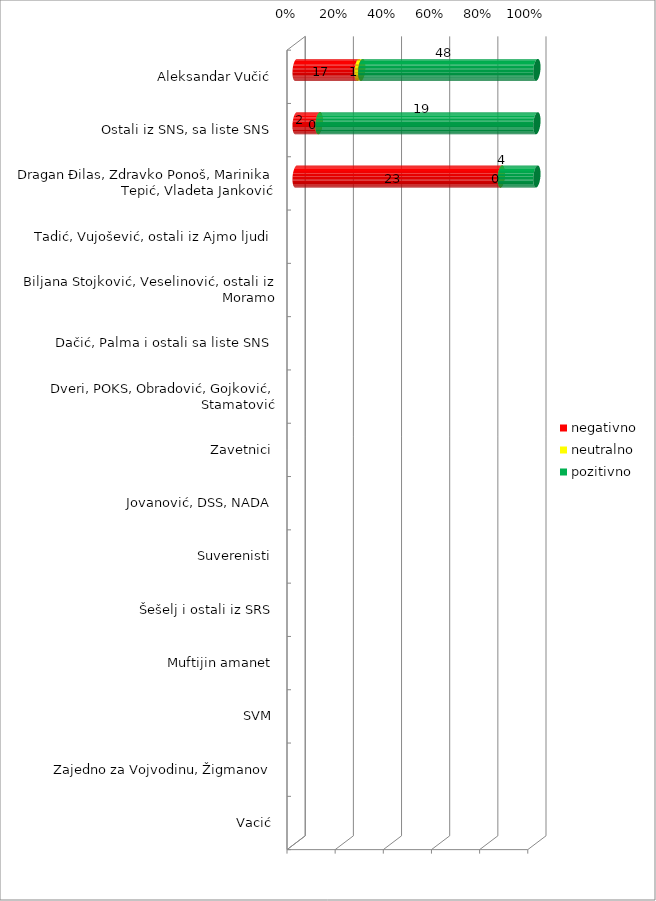
| Category | negativno | neutralno | pozitivno |
|---|---|---|---|
| Aleksandar Vučić | 17 | 1 | 48 |
| Ostali iz SNS, sa liste SNS | 2 | 0 | 19 |
| Dragan Đilas, Zdravko Ponoš, Marinika Tepić, Vladeta Janković | 23 | 0 | 4 |
| Tadić, Vujošević, ostali iz Ajmo ljudi | 0 | 0 | 0 |
| Biljana Stojković, Veselinović, ostali iz Moramo | 0 | 0 | 0 |
| Dačić, Palma i ostali sa liste SNS | 0 | 0 | 0 |
| Dveri, POKS, Obradović, Gojković, Stamatović | 0 | 0 | 0 |
| Zavetnici | 0 | 0 | 0 |
| Jovanović, DSS, NADA | 0 | 0 | 0 |
| Suverenisti | 0 | 0 | 0 |
| Šešelj i ostali iz SRS | 0 | 0 | 0 |
| Muftijin amanet | 0 | 0 | 0 |
| SVM | 0 | 0 | 0 |
| Zajedno za Vojvodinu, Žigmanov | 0 | 0 | 0 |
| Vacić | 0 | 0 | 0 |